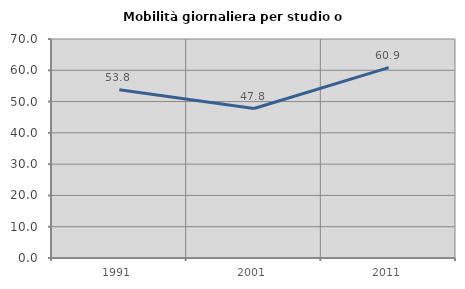
| Category | Mobilità giornaliera per studio o lavoro |
|---|---|
| 1991.0 | 53.769 |
| 2001.0 | 47.778 |
| 2011.0 | 60.87 |